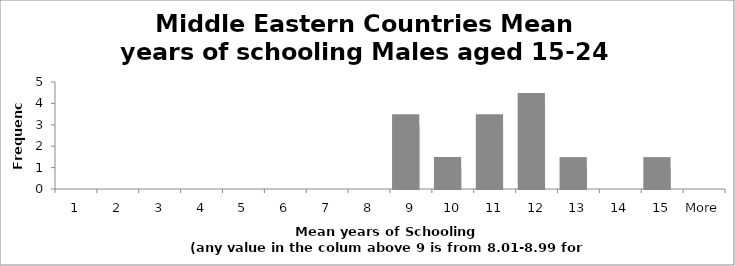
| Category | Frequency |
|---|---|
| 1 | 0 |
| 2 | 0 |
| 3 | 0 |
| 4 | 0 |
| 5 | 0 |
| 6 | 0 |
| 7 | 0 |
| 8 | 0 |
| 9 | 3 |
| 10 | 1 |
| 11 | 3 |
| 12 | 4 |
| 13 | 1 |
| 14 | 0 |
| 15 | 1 |
| More | 0 |